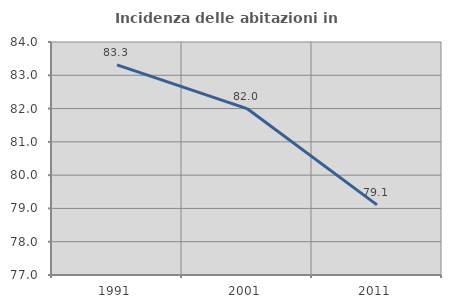
| Category | Incidenza delle abitazioni in proprietà  |
|---|---|
| 1991.0 | 83.314 |
| 2001.0 | 82 |
| 2011.0 | 79.107 |